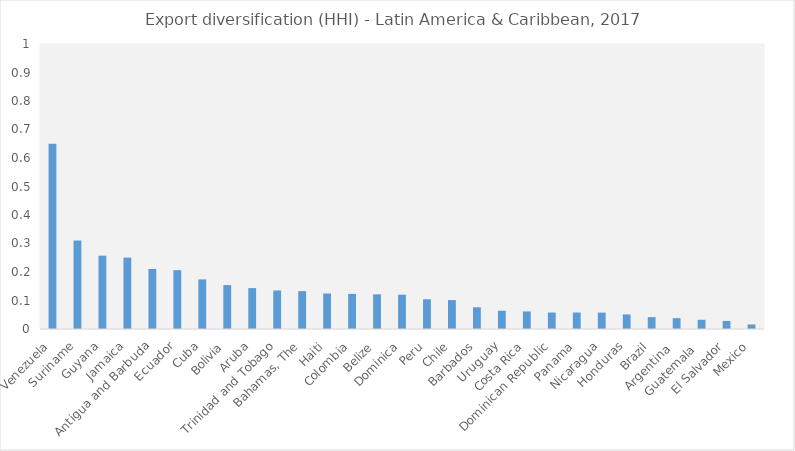
| Category | Series 0 |
|---|---|
| Venezuela | 0.65 |
| Suriname | 0.311 |
| Guyana | 0.257 |
| Jamaica | 0.25 |
| Antigua and Barbuda | 0.211 |
| Ecuador | 0.206 |
| Cuba | 0.174 |
| Bolivia | 0.154 |
| Aruba | 0.144 |
| Trinidad and Tobago | 0.135 |
| Bahamas, The | 0.133 |
| Haiti | 0.125 |
| Colombia | 0.123 |
| Belize | 0.122 |
| Dominica | 0.12 |
| Peru | 0.104 |
| Chile | 0.101 |
| Barbados | 0.076 |
| Uruguay | 0.064 |
| Costa Rica | 0.062 |
| Dominican Republic | 0.058 |
| Panama | 0.058 |
| Nicaragua | 0.058 |
| Honduras | 0.051 |
| Brazil | 0.042 |
| Argentina  | 0.038 |
| Guatemala  | 0.032 |
| El Salvador | 0.028 |
| Mexico | 0.016 |